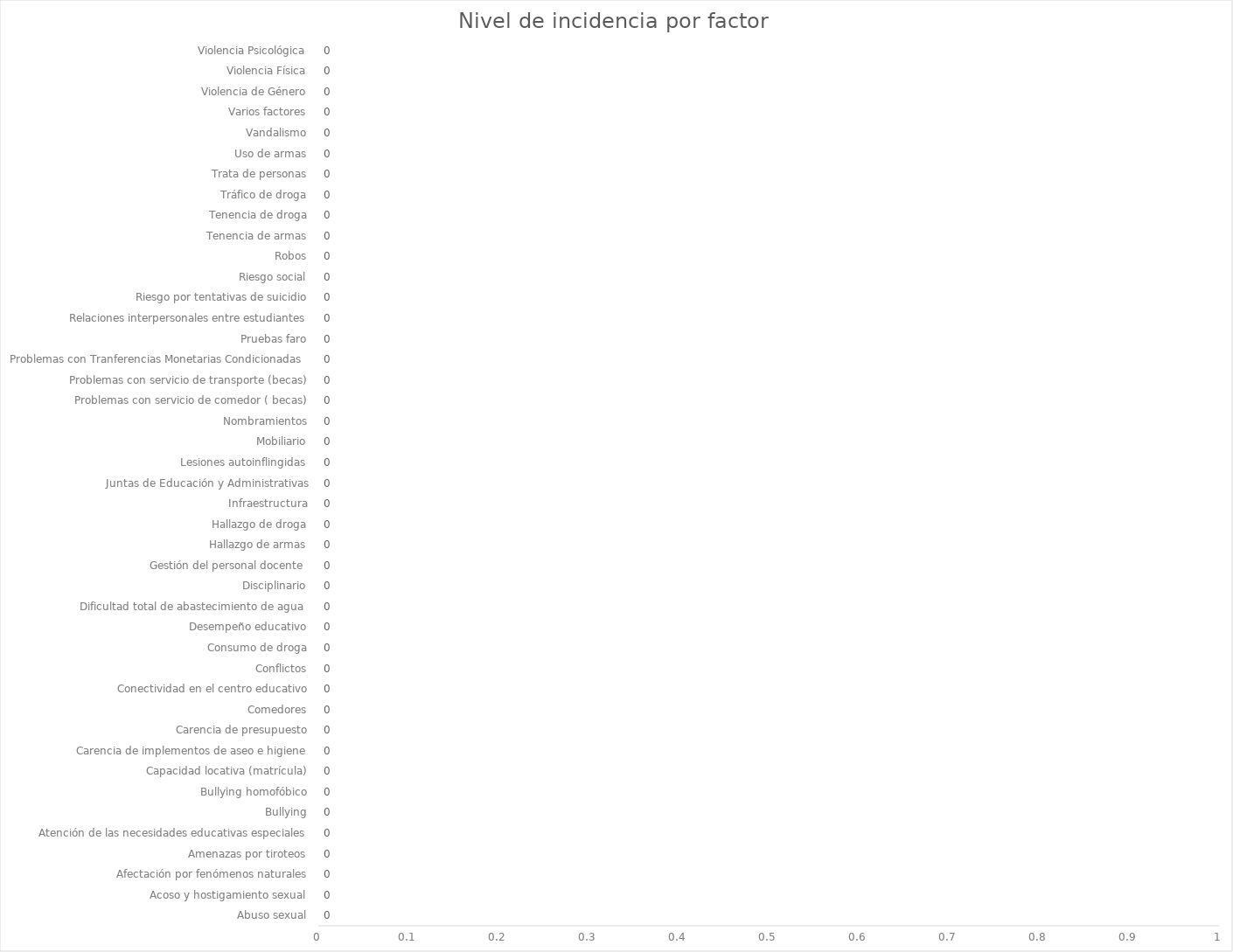
| Category | Series 0 |
|---|---|
| Abuso sexual | 0 |
| Acoso y hostigamiento sexual | 0 |
| Afectación por fenómenos naturales | 0 |
| Amenazas por tiroteos | 0 |
| Atención de las necesidades educativas especiales | 0 |
| Bullying | 0 |
| Bullying homofóbico | 0 |
| Capacidad locativa (matrícula) | 0 |
| Carencia de implementos de aseo e higiene | 0 |
| Carencia de presupuesto | 0 |
| Comedores | 0 |
| Conectividad en el centro educativo | 0 |
| Conflictos | 0 |
| Consumo de droga | 0 |
| Desempeño educativo | 0 |
| Dificultad total de abastecimiento de agua  | 0 |
| Disciplinario | 0 |
| Gestión del personal docente  | 0 |
| Hallazgo de armas | 0 |
| Hallazgo de droga | 0 |
| Infraestructura | 0 |
| Juntas de Educación y Administrativas | 0 |
| Lesiones autoinflingidas | 0 |
| Mobiliario | 0 |
| Nombramientos | 0 |
| Problemas con servicio de comedor ( becas) | 0 |
| Problemas con servicio de transporte (becas) | 0 |
| Problemas con Tranferencias Monetarias Condicionadas  | 0 |
| Pruebas faro | 0 |
| Relaciones interpersonales entre estudiantes | 0 |
| Riesgo por tentativas de suicidio | 0 |
| Riesgo social | 0 |
| Robos | 0 |
| Tenencia de armas | 0 |
| Tenencia de droga | 0 |
| Tráfico de droga | 0 |
| Trata de personas | 0 |
| Uso de armas | 0 |
| Vandalismo | 0 |
| Varios factores | 0 |
| Violencia de Género | 0 |
| Violencia Física | 0 |
| Violencia Psicológica | 0 |